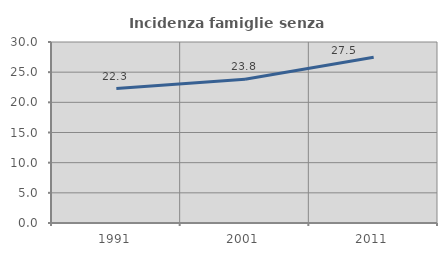
| Category | Incidenza famiglie senza nuclei |
|---|---|
| 1991.0 | 22.277 |
| 2001.0 | 23.81 |
| 2011.0 | 27.478 |